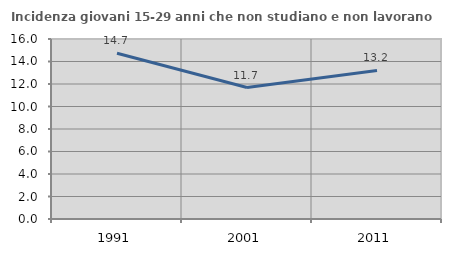
| Category | Incidenza giovani 15-29 anni che non studiano e non lavorano  |
|---|---|
| 1991.0 | 14.727 |
| 2001.0 | 11.688 |
| 2011.0 | 13.208 |